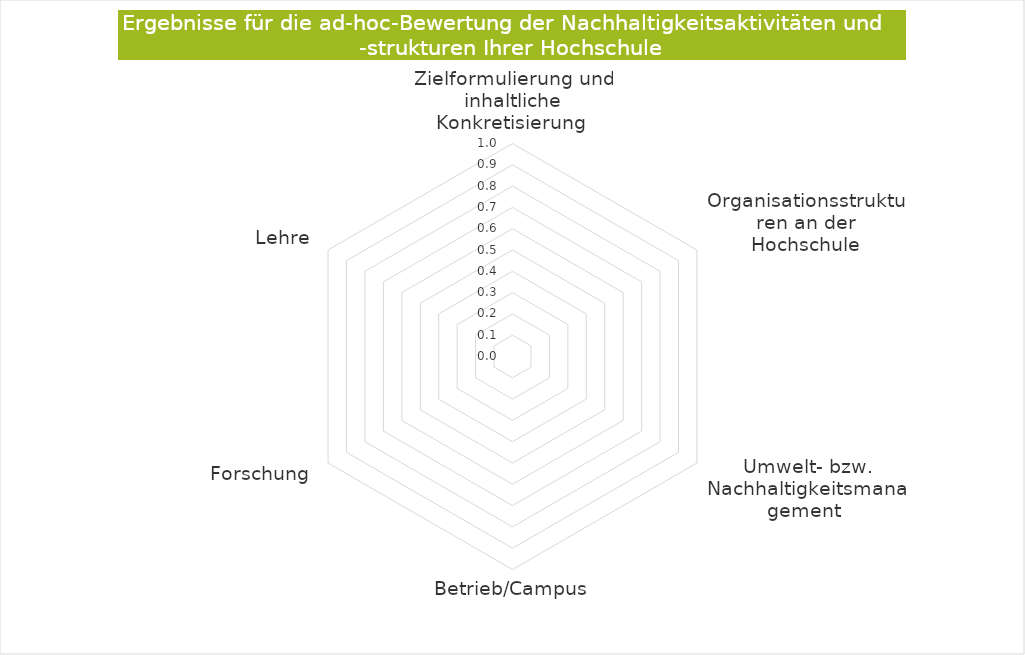
| Category | Series 0 |
|---|---|
| Zielformulierung und inhaltliche Konkretisierung  | 0 |
| Organisationsstrukturen an der Hochschule | 0 |
| Umwelt- bzw. Nachhaltigkeitsmanagement  | 0 |
| Betrieb/Campus | 0 |
| Forschung  | 0 |
| Lehre  | 0 |